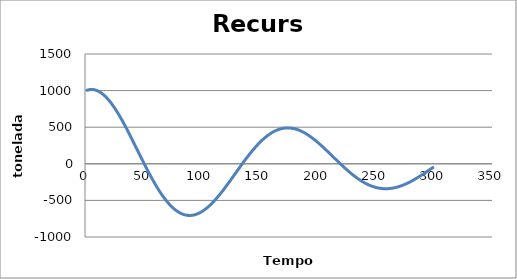
| Category | Series 0 |
|---|---|
| 1.0 | 1000 |
| 2.0 | 1006 |
| 3.0 | 1010.54 |
| 4.0 | 1013.626 |
| 5.0 | 1015.267 |
| 6.0 | 1015.472 |
| 7.0 | 1014.254 |
| 8.0 | 1011.626 |
| 9.0 | 1007.604 |
| 10.0 | 1002.207 |
| 11.0 | 995.453 |
| 12.0 | 987.363 |
| 13.0 | 977.96 |
| 14.0 | 967.269 |
| 15.0 | 955.316 |
| 16.0 | 942.129 |
| 17.0 | 927.736 |
| 18.0 | 912.167 |
| 19.0 | 895.456 |
| 20.0 | 877.635 |
| 21.0 | 858.738 |
| 22.0 | 838.801 |
| 23.0 | 817.862 |
| 24.0 | 795.958 |
| 25.0 | 773.127 |
| 26.0 | 749.411 |
| 27.0 | 724.85 |
| 28.0 | 699.485 |
| 29.0 | 673.358 |
| 30.0 | 646.514 |
| 31.0 | 618.996 |
| 32.0 | 590.847 |
| 33.0 | 562.114 |
| 34.0 | 532.84 |
| 35.0 | 503.073 |
| 36.0 | 472.857 |
| 37.0 | 442.239 |
| 38.0 | 411.265 |
| 39.0 | 379.982 |
| 40.0 | 348.435 |
| 41.0 | 316.673 |
| 42.0 | 284.74 |
| 43.0 | 252.683 |
| 44.0 | 220.548 |
| 45.0 | 188.381 |
| 46.0 | 156.226 |
| 47.0 | 124.13 |
| 48.0 | 92.135 |
| 49.0 | 60.287 |
| 50.0 | 28.628 |
| 51.0 | -2.798 |
| 52.0 | -33.951 |
| 53.0 | -64.788 |
| 54.0 | -95.269 |
| 55.0 | -125.354 |
| 56.0 | -155.006 |
| 57.0 | -184.185 |
| 58.0 | -212.855 |
| 59.0 | -240.981 |
| 60.0 | -268.528 |
| 61.0 | -295.462 |
| 62.0 | -321.75 |
| 63.0 | -347.362 |
| 64.0 | -372.268 |
| 65.0 | -396.438 |
| 66.0 | -419.845 |
| 67.0 | -442.463 |
| 68.0 | -464.267 |
| 69.0 | -485.234 |
| 70.0 | -505.341 |
| 71.0 | -524.568 |
| 72.0 | -542.895 |
| 73.0 | -560.304 |
| 74.0 | -576.779 |
| 75.0 | -592.305 |
| 76.0 | -606.868 |
| 77.0 | -620.456 |
| 78.0 | -633.059 |
| 79.0 | -644.667 |
| 80.0 | -655.273 |
| 81.0 | -664.87 |
| 82.0 | -673.454 |
| 83.0 | -681.021 |
| 84.0 | -687.57 |
| 85.0 | -693.099 |
| 86.0 | -697.611 |
| 87.0 | -701.108 |
| 88.0 | -703.592 |
| 89.0 | -705.071 |
| 90.0 | -705.549 |
| 91.0 | -705.036 |
| 92.0 | -703.54 |
| 93.0 | -701.072 |
| 94.0 | -697.644 |
| 95.0 | -693.268 |
| 96.0 | -687.96 |
| 97.0 | -681.734 |
| 98.0 | -674.607 |
| 99.0 | -666.597 |
| 100.0 | -657.722 |
| 101.0 | -648.003 |
| 102.0 | -637.461 |
| 103.0 | -626.117 |
| 104.0 | -613.993 |
| 105.0 | -601.115 |
| 106.0 | -587.505 |
| 107.0 | -573.191 |
| 108.0 | -558.196 |
| 109.0 | -542.55 |
| 110.0 | -526.278 |
| 111.0 | -509.409 |
| 112.0 | -491.972 |
| 113.0 | -473.997 |
| 114.0 | -455.512 |
| 115.0 | -436.549 |
| 116.0 | -417.138 |
| 117.0 | -397.309 |
| 118.0 | -377.095 |
| 119.0 | -356.527 |
| 120.0 | -335.636 |
| 121.0 | -314.456 |
| 122.0 | -293.017 |
| 123.0 | -271.352 |
| 124.0 | -249.494 |
| 125.0 | -227.475 |
| 126.0 | -205.326 |
| 127.0 | -183.08 |
| 128.0 | -160.77 |
| 129.0 | -138.426 |
| 130.0 | -116.081 |
| 131.0 | -93.765 |
| 132.0 | -71.51 |
| 133.0 | -49.346 |
| 134.0 | -27.303 |
| 135.0 | -5.412 |
| 136.0 | 16.298 |
| 137.0 | 37.799 |
| 138.0 | 59.062 |
| 139.0 | 80.059 |
| 140.0 | 100.764 |
| 141.0 | 121.15 |
| 142.0 | 141.19 |
| 143.0 | 160.861 |
| 144.0 | 180.137 |
| 145.0 | 198.996 |
| 146.0 | 217.413 |
| 147.0 | 235.368 |
| 148.0 | 252.839 |
| 149.0 | 269.805 |
| 150.0 | 286.248 |
| 151.0 | 302.149 |
| 152.0 | 317.49 |
| 153.0 | 332.255 |
| 154.0 | 346.428 |
| 155.0 | 359.993 |
| 156.0 | 372.938 |
| 157.0 | 385.25 |
| 158.0 | 396.916 |
| 159.0 | 407.926 |
| 160.0 | 418.271 |
| 161.0 | 427.941 |
| 162.0 | 436.929 |
| 163.0 | 445.227 |
| 164.0 | 452.831 |
| 165.0 | 459.736 |
| 166.0 | 465.938 |
| 167.0 | 471.434 |
| 168.0 | 476.223 |
| 169.0 | 480.303 |
| 170.0 | 483.677 |
| 171.0 | 486.344 |
| 172.0 | 488.307 |
| 173.0 | 489.57 |
| 174.0 | 490.137 |
| 175.0 | 490.012 |
| 176.0 | 489.203 |
| 177.0 | 487.715 |
| 178.0 | 485.558 |
| 179.0 | 482.739 |
| 180.0 | 479.269 |
| 181.0 | 475.158 |
| 182.0 | 470.417 |
| 183.0 | 465.058 |
| 184.0 | 459.094 |
| 185.0 | 452.538 |
| 186.0 | 445.406 |
| 187.0 | 437.711 |
| 188.0 | 429.469 |
| 189.0 | 420.698 |
| 190.0 | 411.412 |
| 191.0 | 401.631 |
| 192.0 | 391.371 |
| 193.0 | 380.652 |
| 194.0 | 369.492 |
| 195.0 | 357.91 |
| 196.0 | 345.927 |
| 197.0 | 333.563 |
| 198.0 | 320.838 |
| 199.0 | 307.774 |
| 200.0 | 294.391 |
| 201.0 | 280.711 |
| 202.0 | 266.755 |
| 203.0 | 252.547 |
| 204.0 | 238.106 |
| 205.0 | 223.457 |
| 206.0 | 208.621 |
| 207.0 | 193.62 |
| 208.0 | 178.477 |
| 209.0 | 163.215 |
| 210.0 | 147.855 |
| 211.0 | 132.42 |
| 212.0 | 116.933 |
| 213.0 | 101.415 |
| 214.0 | 85.889 |
| 215.0 | 70.376 |
| 216.0 | 54.898 |
| 217.0 | 39.476 |
| 218.0 | 24.132 |
| 219.0 | 8.885 |
| 220.0 | -6.242 |
| 221.0 | -21.231 |
| 222.0 | -36.061 |
| 223.0 | -50.713 |
| 224.0 | -65.169 |
| 225.0 | -79.408 |
| 226.0 | -93.414 |
| 227.0 | -107.169 |
| 228.0 | -120.655 |
| 229.0 | -133.857 |
| 230.0 | -146.757 |
| 231.0 | -159.341 |
| 232.0 | -171.594 |
| 233.0 | -183.502 |
| 234.0 | -195.05 |
| 235.0 | -206.225 |
| 236.0 | -217.016 |
| 237.0 | -227.41 |
| 238.0 | -237.396 |
| 239.0 | -246.964 |
| 240.0 | -256.105 |
| 241.0 | -264.807 |
| 242.0 | -273.065 |
| 243.0 | -280.869 |
| 244.0 | -288.213 |
| 245.0 | -295.09 |
| 246.0 | -301.495 |
| 247.0 | -307.422 |
| 248.0 | -312.868 |
| 249.0 | -317.83 |
| 250.0 | -322.304 |
| 251.0 | -326.288 |
| 252.0 | -329.781 |
| 253.0 | -332.782 |
| 254.0 | -335.292 |
| 255.0 | -337.31 |
| 256.0 | -338.839 |
| 257.0 | -339.881 |
| 258.0 | -340.437 |
| 259.0 | -340.513 |
| 260.0 | -340.11 |
| 261.0 | -339.236 |
| 262.0 | -337.893 |
| 263.0 | -336.09 |
| 264.0 | -333.831 |
| 265.0 | -331.124 |
| 266.0 | -327.977 |
| 267.0 | -324.398 |
| 268.0 | -320.396 |
| 269.0 | -315.979 |
| 270.0 | -311.158 |
| 271.0 | -305.943 |
| 272.0 | -300.345 |
| 273.0 | -294.374 |
| 274.0 | -288.042 |
| 275.0 | -281.362 |
| 276.0 | -274.345 |
| 277.0 | -267.004 |
| 278.0 | -259.353 |
| 279.0 | -251.404 |
| 280.0 | -243.172 |
| 281.0 | -234.67 |
| 282.0 | -225.912 |
| 283.0 | -216.914 |
| 284.0 | -207.69 |
| 285.0 | -198.254 |
| 286.0 | -188.621 |
| 287.0 | -178.807 |
| 288.0 | -168.828 |
| 289.0 | -158.698 |
| 290.0 | -148.433 |
| 291.0 | -138.048 |
| 292.0 | -127.559 |
| 293.0 | -116.982 |
| 294.0 | -106.332 |
| 295.0 | -95.625 |
| 296.0 | -84.876 |
| 297.0 | -74.101 |
| 298.0 | -63.314 |
| 299.0 | -52.532 |
| 300.0 | -41.769 |